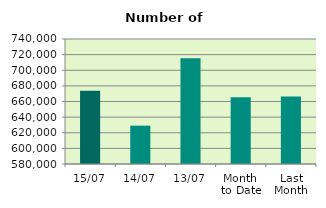
| Category | Series 0 |
|---|---|
| 15/07 | 673888 |
| 14/07 | 629072 |
| 13/07 | 715414 |
| Month 
to Date | 665367.091 |
| Last
Month | 666251.273 |